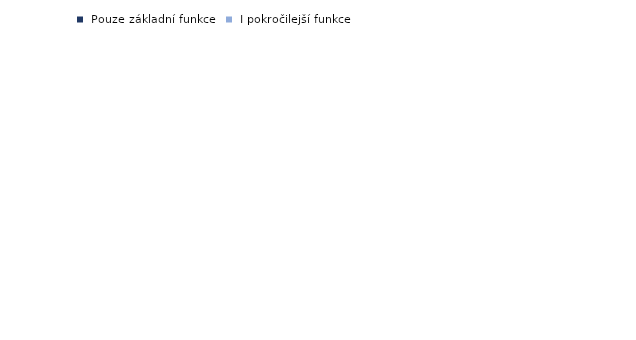
| Category |  Pouze základní funkce |  I pokročilejší funkce |
|---|---|---|
| Celkem (16+) | 23.9 | 21 |
| Pracující celkem | 30.8 | 26.3 |
|  | 0 | 0 |
| Řídící pracovníci | 32.1 | 57.8 |
| Specialisté | 37.2 | 48.1 |
| Techničtí a odborní pracovníci | 36.1 | 43.9 |
| Úředníci | 45.4 | 38.2 |
| Pracovníci ve službách a prodeji | 29.3 | 13.4 |
| Kvalifikovaní pracovníci v zemědělství, lesnictví a rybářství | 13.1 | 11.6 |
| Řemeslníci a opraváři | 26 | 8.1 |
| Obsluha strojů a zařízení, montéři | 20.3 | 5.5 |
| Pomocní a nekvalifikovaní | 16.6 | 2.5 |